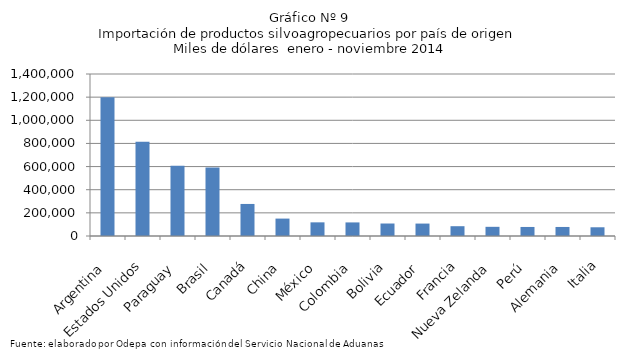
| Category | Series 0 |
|---|---|
| Argentina | 1199136.774 |
| Estados Unidos | 813535.444 |
| Paraguay | 606142.567 |
| Brasil | 591937.53 |
| Canadá | 276965.885 |
| China | 150468.164 |
| México | 118004.202 |
| Colombia | 117367.869 |
| Bolivia | 107922.676 |
| Ecuador | 107419.872 |
| Francia | 84669.25 |
| Nueva Zelanda | 79326.769 |
| Perú | 78137.274 |
| Alemania | 78122.297 |
| Italia | 75396.637 |